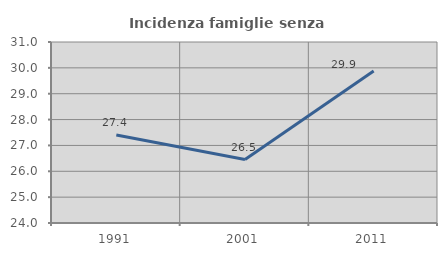
| Category | Incidenza famiglie senza nuclei |
|---|---|
| 1991.0 | 27.405 |
| 2001.0 | 26.456 |
| 2011.0 | 29.877 |